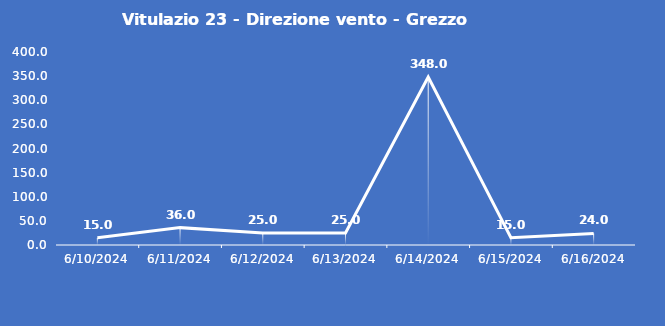
| Category | Vitulazio 23 - Direzione vento - Grezzo (°N) |
|---|---|
| 6/10/24 | 15 |
| 6/11/24 | 36 |
| 6/12/24 | 25 |
| 6/13/24 | 25 |
| 6/14/24 | 348 |
| 6/15/24 | 15 |
| 6/16/24 | 24 |